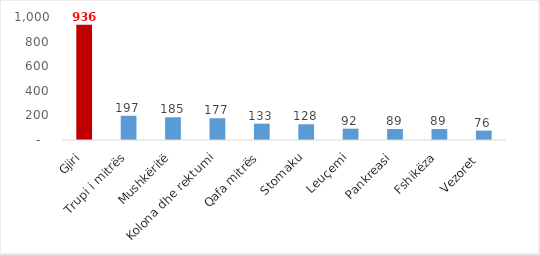
| Category |  Numër (Incidenca)  |
|---|---|
| Gjiri | 936 |
| Trupi i mitrës | 197 |
| Mushkëritë | 185 |
| Kolona dhe rektumi | 177 |
| Qafa mitrës | 133 |
| Stomaku | 128 |
| Leuçemi | 92 |
| Pankreasi | 89 |
| Fshikëza | 89 |
| Vezoret  | 76 |